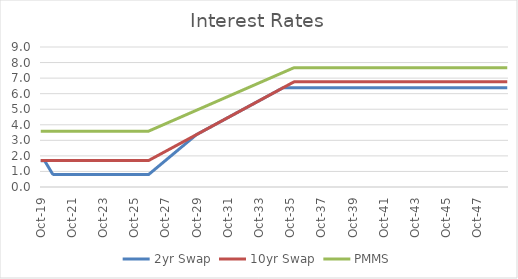
| Category | 2yr Swap | 10yr Swap | PMMS |
|---|---|---|---|
| 2019-10-31 | 1.694 | 1.7 | 3.59 |
| 2019-11-30 | 1.694 | 1.7 | 3.59 |
| 2019-12-31 | 1.694 | 1.7 | 3.59 |
| 2020-01-31 | 1.694 | 1.7 | 3.59 |
| 2020-02-29 | 1.555 | 1.7 | 3.59 |
| 2020-03-31 | 1.415 | 1.7 | 3.59 |
| 2020-04-30 | 1.276 | 1.7 | 3.59 |
| 2020-05-31 | 1.137 | 1.7 | 3.589 |
| 2020-06-30 | 0.997 | 1.7 | 3.589 |
| 2020-07-31 | 0.858 | 1.7 | 3.589 |
| 2020-08-31 | 0.798 | 1.7 | 3.589 |
| 2020-09-30 | 0.798 | 1.7 | 3.589 |
| 2020-10-31 | 0.798 | 1.7 | 3.589 |
| 2020-11-30 | 0.798 | 1.7 | 3.589 |
| 2020-12-31 | 0.798 | 1.7 | 3.589 |
| 2021-01-31 | 0.798 | 1.7 | 3.589 |
| 2021-02-28 | 0.798 | 1.7 | 3.589 |
| 2021-03-31 | 0.798 | 1.7 | 3.589 |
| 2021-04-30 | 0.798 | 1.7 | 3.589 |
| 2021-05-31 | 0.798 | 1.7 | 3.589 |
| 2021-06-30 | 0.798 | 1.7 | 3.589 |
| 2021-07-31 | 0.798 | 1.7 | 3.589 |
| 2021-08-31 | 0.798 | 1.7 | 3.589 |
| 2021-09-30 | 0.798 | 1.7 | 3.589 |
| 2021-10-31 | 0.798 | 1.7 | 3.589 |
| 2021-11-30 | 0.798 | 1.7 | 3.589 |
| 2021-12-31 | 0.798 | 1.7 | 3.589 |
| 2022-01-31 | 0.798 | 1.7 | 3.589 |
| 2022-02-28 | 0.798 | 1.7 | 3.589 |
| 2022-03-31 | 0.798 | 1.7 | 3.589 |
| 2022-04-30 | 0.798 | 1.7 | 3.589 |
| 2022-05-31 | 0.798 | 1.7 | 3.589 |
| 2022-06-30 | 0.798 | 1.7 | 3.589 |
| 2022-07-31 | 0.798 | 1.7 | 3.589 |
| 2022-08-31 | 0.798 | 1.7 | 3.589 |
| 2022-09-30 | 0.798 | 1.7 | 3.589 |
| 2022-10-31 | 0.798 | 1.7 | 3.589 |
| 2022-11-30 | 0.798 | 1.7 | 3.589 |
| 2022-12-31 | 0.798 | 1.7 | 3.589 |
| 2023-01-31 | 0.798 | 1.7 | 3.589 |
| 2023-02-28 | 0.798 | 1.7 | 3.589 |
| 2023-03-31 | 0.798 | 1.7 | 3.589 |
| 2023-04-30 | 0.798 | 1.7 | 3.589 |
| 2023-05-31 | 0.798 | 1.7 | 3.589 |
| 2023-06-30 | 0.798 | 1.7 | 3.589 |
| 2023-07-31 | 0.798 | 1.7 | 3.589 |
| 2023-08-31 | 0.798 | 1.7 | 3.589 |
| 2023-09-30 | 0.798 | 1.7 | 3.589 |
| 2023-10-31 | 0.798 | 1.7 | 3.589 |
| 2023-11-30 | 0.798 | 1.7 | 3.589 |
| 2023-12-31 | 0.798 | 1.7 | 3.589 |
| 2024-01-31 | 0.798 | 1.7 | 3.589 |
| 2024-02-29 | 0.798 | 1.7 | 3.589 |
| 2024-03-31 | 0.798 | 1.7 | 3.589 |
| 2024-04-30 | 0.798 | 1.7 | 3.589 |
| 2024-05-31 | 0.798 | 1.7 | 3.589 |
| 2024-06-30 | 0.798 | 1.7 | 3.589 |
| 2024-07-31 | 0.798 | 1.7 | 3.589 |
| 2024-08-31 | 0.798 | 1.7 | 3.589 |
| 2024-09-30 | 0.798 | 1.7 | 3.589 |
| 2024-10-31 | 0.798 | 1.7 | 3.589 |
| 2024-11-30 | 0.798 | 1.7 | 3.589 |
| 2024-12-31 | 0.798 | 1.7 | 3.589 |
| 2025-01-31 | 0.798 | 1.7 | 3.589 |
| 2025-02-28 | 0.798 | 1.7 | 3.589 |
| 2025-03-31 | 0.798 | 1.7 | 3.589 |
| 2025-04-30 | 0.798 | 1.7 | 3.589 |
| 2025-05-31 | 0.798 | 1.7 | 3.589 |
| 2025-06-30 | 0.798 | 1.7 | 3.589 |
| 2025-07-31 | 0.798 | 1.7 | 3.589 |
| 2025-08-31 | 0.798 | 1.7 | 3.589 |
| 2025-09-30 | 0.798 | 1.7 | 3.589 |
| 2025-10-31 | 0.798 | 1.7 | 3.589 |
| 2025-11-30 | 0.798 | 1.7 | 3.589 |
| 2025-12-31 | 0.798 | 1.7 | 3.589 |
| 2026-01-31 | 0.798 | 1.7 | 3.589 |
| 2026-02-28 | 0.798 | 1.7 | 3.589 |
| 2026-03-31 | 0.798 | 1.7 | 3.589 |
| 2026-04-30 | 0.798 | 1.7 | 3.589 |
| 2026-05-31 | 0.798 | 1.7 | 3.589 |
| 2026-06-30 | 0.798 | 1.7 | 3.589 |
| 2026-07-31 | 0.798 | 1.7 | 3.589 |
| 2026-08-31 | 0.798 | 1.7 | 3.589 |
| 2026-09-30 | 0.798 | 1.7 | 3.589 |
| 2026-10-31 | 0.868 | 1.745 | 3.626 |
| 2026-11-30 | 0.938 | 1.79 | 3.662 |
| 2026-12-31 | 1.007 | 1.836 | 3.699 |
| 2027-01-31 | 1.077 | 1.881 | 3.735 |
| 2027-02-28 | 1.147 | 1.926 | 3.772 |
| 2027-03-31 | 1.216 | 1.971 | 3.808 |
| 2027-04-30 | 1.286 | 2.017 | 3.845 |
| 2027-05-31 | 1.356 | 2.062 | 3.881 |
| 2027-06-30 | 1.425 | 2.107 | 3.917 |
| 2027-07-31 | 1.495 | 2.152 | 3.954 |
| 2027-08-31 | 1.565 | 2.197 | 3.99 |
| 2027-09-30 | 1.634 | 2.243 | 4.027 |
| 2027-10-31 | 1.704 | 2.288 | 4.063 |
| 2027-11-30 | 1.774 | 2.333 | 4.1 |
| 2027-12-31 | 1.843 | 2.378 | 4.136 |
| 2028-01-31 | 1.913 | 2.424 | 4.173 |
| 2028-02-29 | 1.983 | 2.469 | 4.209 |
| 2028-03-31 | 2.052 | 2.514 | 4.246 |
| 2028-04-30 | 2.122 | 2.559 | 4.282 |
| 2028-05-31 | 2.192 | 2.604 | 4.319 |
| 2028-06-30 | 2.261 | 2.65 | 4.355 |
| 2028-07-31 | 2.331 | 2.695 | 4.392 |
| 2028-08-31 | 2.401 | 2.74 | 4.428 |
| 2028-09-30 | 2.47 | 2.785 | 4.465 |
| 2028-10-31 | 2.54 | 2.831 | 4.501 |
| 2028-11-30 | 2.61 | 2.876 | 4.538 |
| 2028-12-31 | 2.679 | 2.921 | 4.574 |
| 2029-01-31 | 2.749 | 2.966 | 4.611 |
| 2029-02-28 | 2.819 | 3.011 | 4.647 |
| 2029-03-31 | 2.888 | 3.057 | 4.684 |
| 2029-04-30 | 2.958 | 3.102 | 4.72 |
| 2029-05-31 | 3.028 | 3.147 | 4.757 |
| 2029-06-30 | 3.097 | 3.192 | 4.793 |
| 2029-07-31 | 3.167 | 3.237 | 4.829 |
| 2029-08-31 | 3.237 | 3.283 | 4.866 |
| 2029-09-30 | 3.306 | 3.328 | 4.902 |
| 2029-10-31 | 3.373 | 3.373 | 4.939 |
| 2029-11-30 | 3.418 | 3.418 | 4.975 |
| 2029-12-31 | 3.464 | 3.464 | 5.012 |
| 2030-01-31 | 3.509 | 3.509 | 5.048 |
| 2030-02-28 | 3.554 | 3.554 | 5.085 |
| 2030-03-31 | 3.599 | 3.599 | 5.121 |
| 2030-04-30 | 3.644 | 3.644 | 5.158 |
| 2030-05-31 | 3.69 | 3.69 | 5.194 |
| 2030-06-30 | 3.735 | 3.735 | 5.231 |
| 2030-07-31 | 3.78 | 3.78 | 5.267 |
| 2030-08-31 | 3.825 | 3.825 | 5.304 |
| 2030-09-30 | 3.871 | 3.871 | 5.34 |
| 2030-10-31 | 3.916 | 3.916 | 5.376 |
| 2030-11-30 | 3.961 | 3.961 | 5.413 |
| 2030-12-31 | 4.006 | 4.006 | 5.449 |
| 2031-01-31 | 4.051 | 4.051 | 5.486 |
| 2031-02-28 | 4.097 | 4.097 | 5.522 |
| 2031-03-31 | 4.142 | 4.142 | 5.559 |
| 2031-04-30 | 4.187 | 4.187 | 5.595 |
| 2031-05-31 | 4.232 | 4.232 | 5.632 |
| 2031-06-30 | 4.278 | 4.278 | 5.668 |
| 2031-07-31 | 4.323 | 4.323 | 5.705 |
| 2031-08-31 | 4.368 | 4.368 | 5.741 |
| 2031-09-30 | 4.413 | 4.413 | 5.778 |
| 2031-10-31 | 4.458 | 4.458 | 5.814 |
| 2031-11-30 | 4.504 | 4.504 | 5.85 |
| 2031-12-31 | 4.549 | 4.549 | 5.887 |
| 2032-01-31 | 4.594 | 4.594 | 5.923 |
| 2032-02-29 | 4.639 | 4.639 | 5.96 |
| 2032-03-31 | 4.685 | 4.685 | 5.996 |
| 2032-04-30 | 4.73 | 4.73 | 6.033 |
| 2032-05-31 | 4.775 | 4.775 | 6.069 |
| 2032-06-30 | 4.82 | 4.82 | 6.106 |
| 2032-07-31 | 4.865 | 4.865 | 6.142 |
| 2032-08-31 | 4.911 | 4.911 | 6.179 |
| 2032-09-30 | 4.956 | 4.956 | 6.215 |
| 2032-10-31 | 5.001 | 5.001 | 6.252 |
| 2032-11-30 | 5.046 | 5.046 | 6.288 |
| 2032-12-31 | 5.092 | 5.092 | 6.324 |
| 2033-01-31 | 5.137 | 5.137 | 6.361 |
| 2033-02-28 | 5.182 | 5.182 | 6.397 |
| 2033-03-31 | 5.227 | 5.227 | 6.434 |
| 2033-04-30 | 5.272 | 5.272 | 6.47 |
| 2033-05-31 | 5.318 | 5.318 | 6.507 |
| 2033-06-30 | 5.363 | 5.363 | 6.543 |
| 2033-07-31 | 5.408 | 5.408 | 6.58 |
| 2033-08-31 | 5.453 | 5.453 | 6.616 |
| 2033-09-30 | 5.499 | 5.499 | 6.653 |
| 2033-10-31 | 5.544 | 5.544 | 6.689 |
| 2033-11-30 | 5.589 | 5.589 | 6.726 |
| 2033-12-31 | 5.634 | 5.634 | 6.762 |
| 2034-01-31 | 5.679 | 5.679 | 6.798 |
| 2034-02-28 | 5.725 | 5.725 | 6.835 |
| 2034-03-31 | 5.77 | 5.77 | 6.871 |
| 2034-04-30 | 5.815 | 5.815 | 6.908 |
| 2034-05-31 | 5.86 | 5.86 | 6.944 |
| 2034-06-30 | 5.906 | 5.906 | 6.981 |
| 2034-07-31 | 5.951 | 5.951 | 7.017 |
| 2034-08-31 | 5.996 | 5.996 | 7.054 |
| 2034-09-30 | 6.041 | 6.041 | 7.09 |
| 2034-10-31 | 6.086 | 6.086 | 7.127 |
| 2034-11-30 | 6.132 | 6.132 | 7.163 |
| 2034-12-31 | 6.177 | 6.177 | 7.2 |
| 2035-01-31 | 6.222 | 6.222 | 7.236 |
| 2035-02-28 | 6.267 | 6.267 | 7.272 |
| 2035-03-31 | 6.312 | 6.312 | 7.309 |
| 2035-04-30 | 6.358 | 6.358 | 7.345 |
| 2035-05-31 | 6.387 | 6.403 | 7.382 |
| 2035-06-30 | 6.387 | 6.448 | 7.418 |
| 2035-07-31 | 6.387 | 6.493 | 7.455 |
| 2035-08-31 | 6.387 | 6.539 | 7.491 |
| 2035-09-30 | 6.387 | 6.584 | 7.528 |
| 2035-10-31 | 6.387 | 6.629 | 7.564 |
| 2035-11-30 | 6.387 | 6.674 | 7.6 |
| 2035-12-31 | 6.387 | 6.719 | 7.637 |
| 2036-01-31 | 6.387 | 6.758 | 7.668 |
| 2036-02-29 | 6.387 | 6.758 | 7.668 |
| 2036-03-31 | 6.387 | 6.758 | 7.668 |
| 2036-04-30 | 6.387 | 6.758 | 7.668 |
| 2036-05-31 | 6.387 | 6.758 | 7.668 |
| 2036-06-30 | 6.387 | 6.758 | 7.668 |
| 2036-07-31 | 6.387 | 6.758 | 7.668 |
| 2036-08-31 | 6.387 | 6.758 | 7.668 |
| 2036-09-30 | 6.387 | 6.758 | 7.668 |
| 2036-10-31 | 6.387 | 6.758 | 7.668 |
| 2036-11-30 | 6.387 | 6.758 | 7.668 |
| 2036-12-31 | 6.387 | 6.758 | 7.668 |
| 2037-01-31 | 6.387 | 6.758 | 7.668 |
| 2037-02-28 | 6.387 | 6.758 | 7.668 |
| 2037-03-31 | 6.387 | 6.758 | 7.668 |
| 2037-04-30 | 6.387 | 6.758 | 7.668 |
| 2037-05-31 | 6.387 | 6.758 | 7.668 |
| 2037-06-30 | 6.387 | 6.758 | 7.668 |
| 2037-07-31 | 6.387 | 6.758 | 7.668 |
| 2037-08-31 | 6.387 | 6.758 | 7.668 |
| 2037-09-30 | 6.387 | 6.758 | 7.668 |
| 2037-10-31 | 6.387 | 6.758 | 7.668 |
| 2037-11-30 | 6.387 | 6.758 | 7.668 |
| 2037-12-31 | 6.387 | 6.758 | 7.668 |
| 2038-01-31 | 6.387 | 6.758 | 7.668 |
| 2038-02-28 | 6.387 | 6.758 | 7.668 |
| 2038-03-31 | 6.387 | 6.758 | 7.668 |
| 2038-04-30 | 6.387 | 6.758 | 7.668 |
| 2038-05-31 | 6.387 | 6.758 | 7.668 |
| 2038-06-30 | 6.387 | 6.758 | 7.668 |
| 2038-07-31 | 6.387 | 6.758 | 7.668 |
| 2038-08-31 | 6.387 | 6.758 | 7.668 |
| 2038-09-30 | 6.387 | 6.758 | 7.668 |
| 2038-10-31 | 6.387 | 6.758 | 7.668 |
| 2038-11-30 | 6.387 | 6.758 | 7.668 |
| 2038-12-31 | 6.387 | 6.758 | 7.668 |
| 2039-01-31 | 6.387 | 6.758 | 7.668 |
| 2039-02-28 | 6.387 | 6.758 | 7.668 |
| 2039-03-31 | 6.387 | 6.758 | 7.668 |
| 2039-04-30 | 6.387 | 6.758 | 7.668 |
| 2039-05-31 | 6.387 | 6.758 | 7.668 |
| 2039-06-30 | 6.387 | 6.758 | 7.668 |
| 2039-07-31 | 6.387 | 6.758 | 7.668 |
| 2039-08-31 | 6.387 | 6.758 | 7.668 |
| 2039-09-30 | 6.387 | 6.758 | 7.668 |
| 2039-10-31 | 6.387 | 6.758 | 7.668 |
| 2039-11-30 | 6.387 | 6.758 | 7.668 |
| 2039-12-31 | 6.387 | 6.758 | 7.668 |
| 2040-01-31 | 6.387 | 6.758 | 7.668 |
| 2040-02-29 | 6.387 | 6.758 | 7.668 |
| 2040-03-31 | 6.387 | 6.758 | 7.668 |
| 2040-04-30 | 6.387 | 6.758 | 7.668 |
| 2040-05-31 | 6.387 | 6.758 | 7.668 |
| 2040-06-30 | 6.387 | 6.758 | 7.668 |
| 2040-07-31 | 6.387 | 6.758 | 7.668 |
| 2040-08-31 | 6.387 | 6.758 | 7.668 |
| 2040-09-30 | 6.387 | 6.758 | 7.668 |
| 2040-10-31 | 6.387 | 6.758 | 7.668 |
| 2040-11-30 | 6.387 | 6.758 | 7.668 |
| 2040-12-31 | 6.387 | 6.758 | 7.668 |
| 2041-01-31 | 6.387 | 6.758 | 7.668 |
| 2041-02-28 | 6.387 | 6.758 | 7.668 |
| 2041-03-31 | 6.387 | 6.758 | 7.668 |
| 2041-04-30 | 6.387 | 6.758 | 7.668 |
| 2041-05-31 | 6.387 | 6.758 | 7.668 |
| 2041-06-30 | 6.387 | 6.758 | 7.668 |
| 2041-07-31 | 6.387 | 6.758 | 7.668 |
| 2041-08-31 | 6.387 | 6.758 | 7.668 |
| 2041-09-30 | 6.387 | 6.758 | 7.668 |
| 2041-10-31 | 6.387 | 6.758 | 7.668 |
| 2041-11-30 | 6.387 | 6.758 | 7.668 |
| 2041-12-31 | 6.387 | 6.758 | 7.668 |
| 2042-01-31 | 6.387 | 6.758 | 7.668 |
| 2042-02-28 | 6.387 | 6.758 | 7.668 |
| 2042-03-31 | 6.387 | 6.758 | 7.668 |
| 2042-04-30 | 6.387 | 6.758 | 7.668 |
| 2042-05-31 | 6.387 | 6.758 | 7.668 |
| 2042-06-30 | 6.387 | 6.758 | 7.668 |
| 2042-07-31 | 6.387 | 6.758 | 7.668 |
| 2042-08-31 | 6.387 | 6.758 | 7.668 |
| 2042-09-30 | 6.387 | 6.758 | 7.668 |
| 2042-10-31 | 6.387 | 6.758 | 7.668 |
| 2042-11-30 | 6.387 | 6.758 | 7.668 |
| 2042-12-31 | 6.387 | 6.758 | 7.668 |
| 2043-01-31 | 6.387 | 6.758 | 7.668 |
| 2043-02-28 | 6.387 | 6.758 | 7.668 |
| 2043-03-31 | 6.387 | 6.758 | 7.668 |
| 2043-04-30 | 6.387 | 6.758 | 7.668 |
| 2043-05-31 | 6.387 | 6.758 | 7.668 |
| 2043-06-30 | 6.387 | 6.758 | 7.668 |
| 2043-07-31 | 6.387 | 6.758 | 7.668 |
| 2043-08-31 | 6.387 | 6.758 | 7.668 |
| 2043-09-30 | 6.387 | 6.758 | 7.668 |
| 2043-10-31 | 6.387 | 6.758 | 7.668 |
| 2043-11-30 | 6.387 | 6.758 | 7.668 |
| 2043-12-31 | 6.387 | 6.758 | 7.668 |
| 2044-01-31 | 6.387 | 6.758 | 7.668 |
| 2044-02-29 | 6.387 | 6.758 | 7.668 |
| 2044-03-31 | 6.387 | 6.758 | 7.668 |
| 2044-04-30 | 6.387 | 6.758 | 7.668 |
| 2044-05-31 | 6.387 | 6.758 | 7.668 |
| 2044-06-30 | 6.387 | 6.758 | 7.668 |
| 2044-07-31 | 6.387 | 6.758 | 7.668 |
| 2044-08-31 | 6.387 | 6.758 | 7.668 |
| 2044-09-30 | 6.387 | 6.758 | 7.668 |
| 2044-10-31 | 6.387 | 6.758 | 7.668 |
| 2044-11-30 | 6.387 | 6.758 | 7.668 |
| 2044-12-31 | 6.387 | 6.758 | 7.668 |
| 2045-01-31 | 6.387 | 6.758 | 7.668 |
| 2045-02-28 | 6.387 | 6.758 | 7.668 |
| 2045-03-31 | 6.387 | 6.758 | 7.668 |
| 2045-04-30 | 6.387 | 6.758 | 7.668 |
| 2045-05-31 | 6.387 | 6.758 | 7.668 |
| 2045-06-30 | 6.387 | 6.758 | 7.668 |
| 2045-07-31 | 6.387 | 6.758 | 7.668 |
| 2045-08-31 | 6.387 | 6.758 | 7.668 |
| 2045-09-30 | 6.387 | 6.758 | 7.668 |
| 2045-10-31 | 6.387 | 6.758 | 7.668 |
| 2045-11-30 | 6.387 | 6.758 | 7.668 |
| 2045-12-31 | 6.387 | 6.758 | 7.668 |
| 2046-01-31 | 6.387 | 6.758 | 7.668 |
| 2046-02-28 | 6.387 | 6.758 | 7.668 |
| 2046-03-31 | 6.387 | 6.758 | 7.668 |
| 2046-04-30 | 6.387 | 6.758 | 7.668 |
| 2046-05-31 | 6.387 | 6.758 | 7.668 |
| 2046-06-30 | 6.387 | 6.758 | 7.668 |
| 2046-07-31 | 6.387 | 6.758 | 7.668 |
| 2046-08-31 | 6.387 | 6.758 | 7.668 |
| 2046-09-30 | 6.387 | 6.758 | 7.668 |
| 2046-10-31 | 6.387 | 6.758 | 7.668 |
| 2046-11-30 | 6.387 | 6.758 | 7.668 |
| 2046-12-31 | 6.387 | 6.758 | 7.668 |
| 2047-01-31 | 6.387 | 6.758 | 7.668 |
| 2047-02-28 | 6.387 | 6.758 | 7.668 |
| 2047-03-31 | 6.387 | 6.758 | 7.668 |
| 2047-04-30 | 6.387 | 6.758 | 7.668 |
| 2047-05-31 | 6.387 | 6.758 | 7.668 |
| 2047-06-30 | 6.387 | 6.758 | 7.668 |
| 2047-07-31 | 6.387 | 6.758 | 7.668 |
| 2047-08-31 | 6.387 | 6.758 | 7.668 |
| 2047-09-30 | 6.387 | 6.758 | 7.668 |
| 2047-10-31 | 6.387 | 6.758 | 7.668 |
| 2047-11-30 | 6.387 | 6.758 | 7.668 |
| 2047-12-31 | 6.387 | 6.758 | 7.668 |
| 2048-01-31 | 6.387 | 6.758 | 7.668 |
| 2048-02-29 | 6.387 | 6.758 | 7.668 |
| 2048-03-31 | 6.387 | 6.758 | 7.668 |
| 2048-04-30 | 6.387 | 6.758 | 7.668 |
| 2048-05-31 | 6.387 | 6.758 | 7.668 |
| 2048-06-30 | 6.387 | 6.758 | 7.668 |
| 2048-07-31 | 6.387 | 6.758 | 7.668 |
| 2048-08-31 | 6.387 | 6.758 | 7.668 |
| 2048-09-30 | 6.387 | 6.758 | 7.668 |
| 2048-10-31 | 6.387 | 6.758 | 7.668 |
| 2048-11-30 | 6.387 | 6.758 | 7.668 |
| 2048-12-31 | 6.387 | 6.758 | 7.668 |
| 2049-01-31 | 6.387 | 6.758 | 7.668 |
| 2049-02-28 | 6.387 | 6.758 | 7.668 |
| 2049-03-31 | 6.387 | 6.758 | 7.668 |
| 2049-04-30 | 6.387 | 6.758 | 7.668 |
| 2049-05-31 | 6.387 | 6.758 | 7.668 |
| 2049-06-30 | 6.387 | 6.758 | 7.668 |
| 2049-07-31 | 6.387 | 6.758 | 7.668 |
| 2049-08-31 | 6.387 | 6.758 | 7.668 |
| 2049-09-30 | 6.387 | 6.758 | 7.668 |